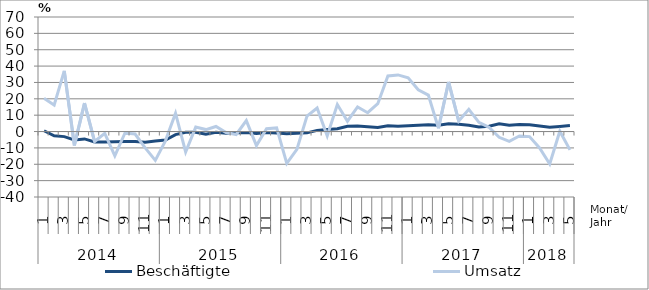
| Category | Beschäftigte | Umsatz |
|---|---|---|
| 0 | 0.5 | 20.3 |
| 1 | -2.6 | 16.2 |
| 2 | -3.1 | 37.1 |
| 3 | -5.1 | -8.5 |
| 4 | -4.5 | 17.4 |
| 5 | -6.4 | -6.1 |
| 6 | -6.4 | -1.1 |
| 7 | -6.2 | -14.9 |
| 8 | -6.1 | -0.9 |
| 9 | -6.1 | -1.5 |
| 10 | -6.6 | -10 |
| 11 | -5.8 | -17.6 |
| 12 | -5.2 | -5.7 |
| 13 | -1.9 | 11.2 |
| 14 | -0.5 | -12.5 |
| 15 | -0.5 | 2.7 |
| 16 | -1.7 | 1.2 |
| 17 | -0.5 | 3.1 |
| 18 | -1.1 | -0.6 |
| 19 | -0.8 | -1.8 |
| 20 | -0.6 | 6.7 |
| 21 | -1.2 | -8.6 |
| 22 | -0.6 | 1.7 |
| 23 | -0.9 | 2.2 |
| 24 | -1.3 | -19.4 |
| 25 | -1.1 | -10.9 |
| 26 | -0.8 | 9.4 |
| 27 | 0.7 | 14.4 |
| 28 | 1.2 | -2.6 |
| 29 | 1.7 | 16.5 |
| 30 | 3.2 | 6.3 |
| 31 | 3.4 | 15 |
| 32 | 3 | 11.5 |
| 33 | 2.5 | 17 |
| 34 | 3.6 | 34 |
| 35 | 3.2 | 34.6 |
| 36 | 3.5 | 32.8 |
| 37 | 3.8 | 25.5 |
| 38 | 4.2 | 22.3 |
| 39 | 3.9 | 2 |
| 40 | 4.7 | 30.3 |
| 41 | 4.4 | 6.4 |
| 42 | 3.9 | 13.6 |
| 43 | 2.8 | 5.6 |
| 44 | 3.3 | 2.6 |
| 45 | 4.7 | -3.5 |
| 46 | 3.8 | -6 |
| 47 | 4.3 | -2.7 |
| 48 | 4.2 | -3.1 |
| 49 | 3.4 | -10 |
| 50 | 2.6 | -19.8 |
| 51 | 3.1 | 0.2 |
| 52 | 3.7 | -11.2 |